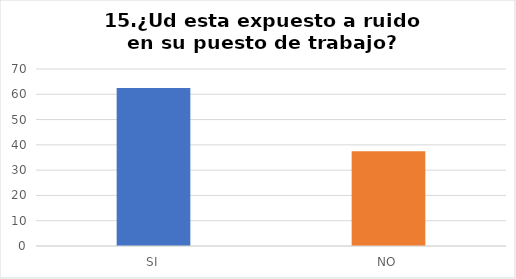
| Category | ¿Ud esta expuesto a ruido en su puesto de trabajo? |
|---|---|
| SI | 62.5 |
| NO | 37.5 |